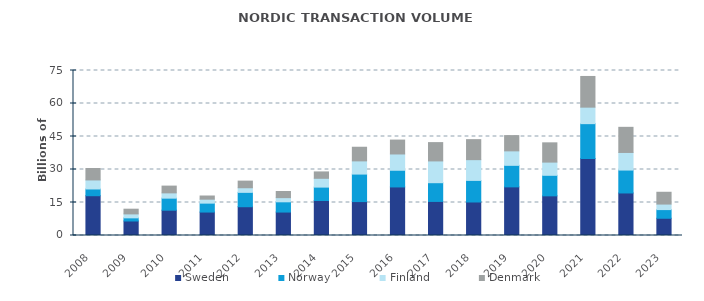
| Category | Sweden | Norway | Finland | Denmark |
|---|---|---|---|---|
| 2008.0 | 18.086 | 3.064 | 4.1 | 5.218 |
| 2009.0 | 6.597 | 1.423 | 1.8 | 2.141 |
| 2010.0 | 11.505 | 5.471 | 2.4 | 3.077 |
| 2011.0 | 10.657 | 4.049 | 1.8 | 1.446 |
| 2012.0 | 13.08 | 6.529 | 2.1 | 3.01 |
| 2013.0 | 10.654 | 4.661 | 1.9 | 2.784 |
| 2014.0 | 15.914 | 6.084 | 4 | 2.903 |
| 2015.0 | 15.417 | 12.5 | 6 | 6.2 |
| 2016.0 | 22.076 | 7.574 | 7.406 | 6.317 |
| 2017.0 | 15.489 | 8.511 | 9.9 | 8.325 |
| 2018.0 | 15.231 | 9.812 | 9.435 | 9.094 |
| 2019.0 | 22.101 | 9.791 | 6.577 | 6.942 |
| 2020.0 | 18.027 | 9.334 | 5.998 | 8.76 |
| 2021.0 | 34.993 | 15.847 | 7.497 | 13.953 |
| 2022.0 | 19.332 | 10.412 | 8 | 11.425 |
| 2023.0 | 7.836 | 3.938 | 2.51 | 5.369 |